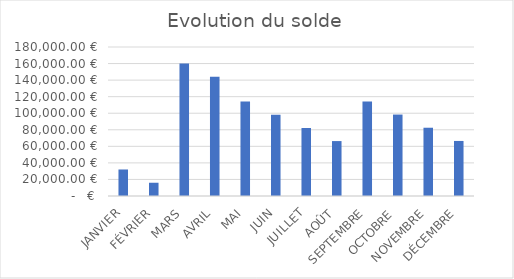
| Category | Series 0 |
|---|---|
| JANVIER | 32032.3 |
| FÉVRIER | 16011.33 |
| MARS | 160009.36 |
| AVRIL | 144100.39 |
| MAI | 114199.42 |
| JUIN | 98157.45 |
| JUILLET | 82121.48 |
| AOÛT | 66355.51 |
| SEPTEMBRE | 114230.54 |
| OCTOBRE | 98383.57 |
| NOVEMBRE | 82472.6 |
| DÉCEMBRE | 66497.63 |